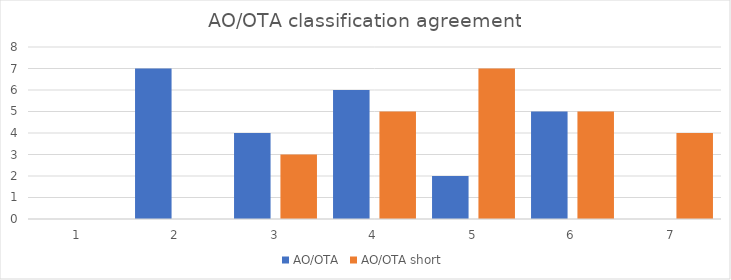
| Category | Full Neer | Clinical Neer | AO/OTA | AO/OTA short |
|---|---|---|---|---|
| 0 | 0 | 0 | 0 | 0 |
| 1 | 5 | 1 | 7 | 0 |
| 2 | 5 | 4 | 4 | 3 |
| 3 | 3 | 6 | 6 | 5 |
| 4 | 4 | 2 | 2 | 7 |
| 5 | 6 | 9 | 5 | 5 |
| 6 | 1 | 2 | 0 | 4 |